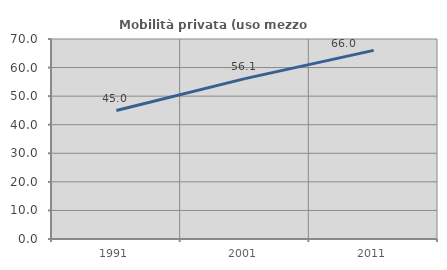
| Category | Mobilità privata (uso mezzo privato) |
|---|---|
| 1991.0 | 44.953 |
| 2001.0 | 56.134 |
| 2011.0 | 66.03 |